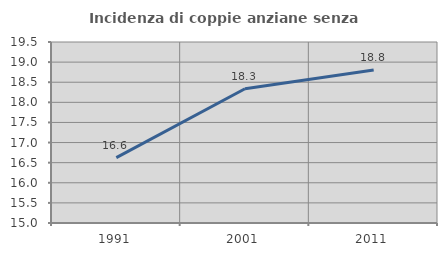
| Category | Incidenza di coppie anziane senza figli  |
|---|---|
| 1991.0 | 16.625 |
| 2001.0 | 18.338 |
| 2011.0 | 18.802 |